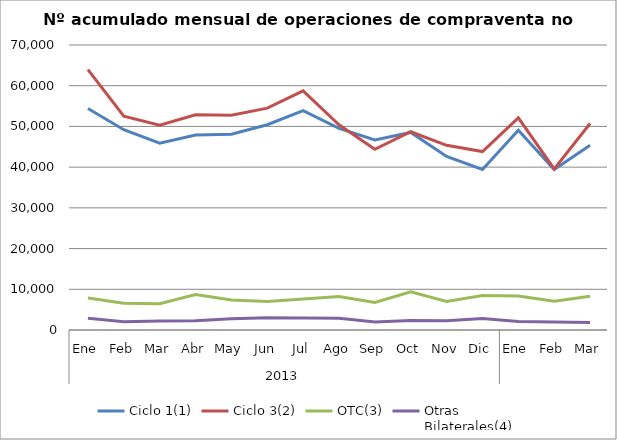
| Category | Ciclo 1(1) | Ciclo 3(2) | OTC(3) | Otras
Bilaterales(4) |
|---|---|---|---|---|
| 0 | 54386 | 63960 | 7873 | 2891 |
| 1 | 49196 | 52525 | 6550 | 2012 |
| 2 | 45892 | 50320 | 6475 | 2233 |
| 3 | 47876 | 52874 | 8686 | 2274 |
| 4 | 48091 | 52767 | 7394 | 2733 |
| 5 | 50415 | 54485 | 6994 | 3021 |
| 6 | 53879 | 58744 | 7586 | 2959 |
| 7 | 49504 | 50401 | 8243 | 2889 |
| 8 | 46688 | 44370 | 6784 | 1951 |
| 9 | 48531 | 48693 | 9357 | 2324 |
| 10 | 42642 | 45362 | 7000 | 2275 |
| 11 | 39447 | 43831 | 8487 | 2831 |
| 12 | 49087 | 52117 | 8357 | 2090 |
| 13 | 39397 | 39565 | 7045 | 1958 |
| 14 | 45373 | 50721 | 8313 | 1843 |